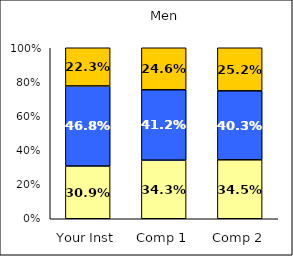
| Category | Low Overall Satisfaction | Average Overall Satisfaction | High Overall Satisfaction |
|---|---|---|---|
| Your Inst | 0.309 | 0.468 | 0.223 |
| Comp 1 | 0.343 | 0.412 | 0.246 |
| Comp 2 | 0.345 | 0.403 | 0.252 |